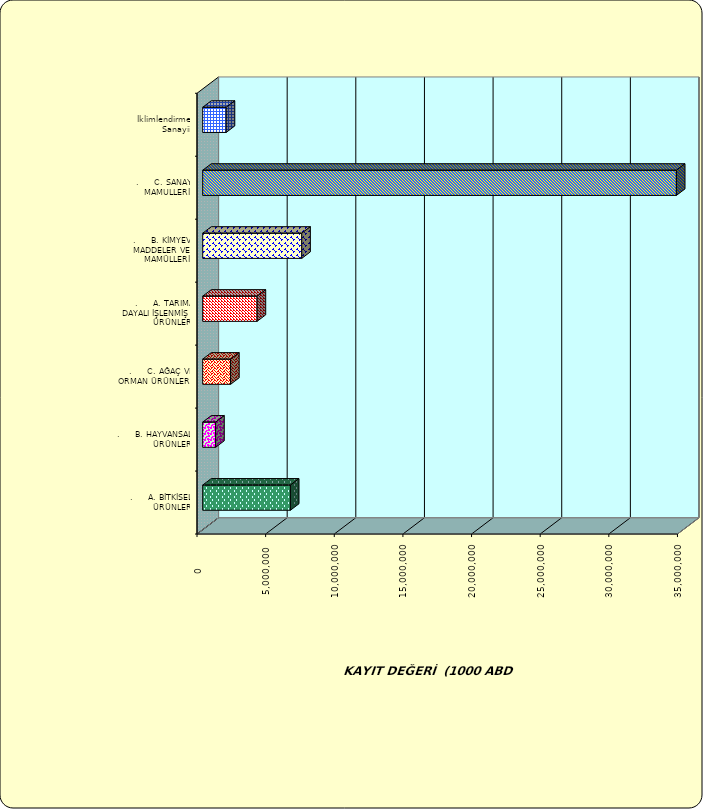
| Category | Series 0 |
|---|---|
| .     A. BİTKİSEL ÜRÜNLER | 6388991.348 |
| .     B. HAYVANSAL ÜRÜNLER | 945856.562 |
| .     C. AĞAÇ VE ORMAN ÜRÜNLERİ | 2032746.95 |
| .     A. TARIMA DAYALI İŞLENMİŞ ÜRÜNLER | 3962658.84 |
| .     B. KİMYEVİ MADDELER VE MAMÜLLERİ | 7216725.736 |
| .     C. SANAYİ MAMULLERİ | 34507196.348 |
|  İklimlendirme Sanayii | 1711003.391 |